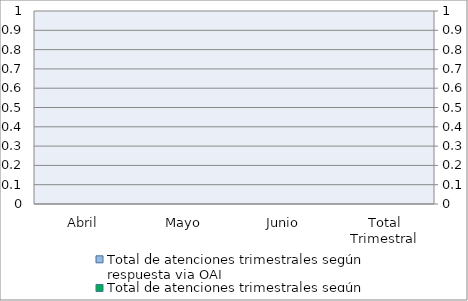
| Category | Total de atenciones trimestrales según respuesta via OAI | Series 2 | Series 4 |
|---|---|---|---|
| Abril | 0 |  |  |
| Mayo | 0 |  |  |
| Junio | 0 |  |  |
| Total Trimestral | 0 |  |  |